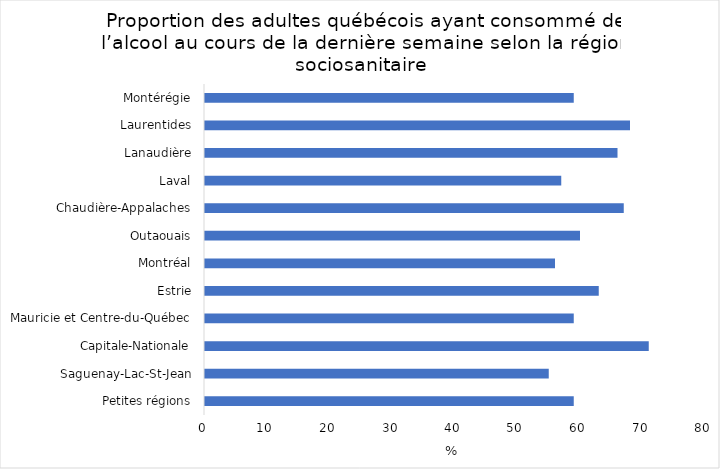
| Category | Series 0 |
|---|---|
| Petites régions | 59 |
| Saguenay-Lac-St-Jean | 55 |
| Capitale-Nationale | 71 |
| Mauricie et Centre-du-Québec | 59 |
| Estrie | 63 |
| Montréal | 56 |
| Outaouais | 60 |
| Chaudière-Appalaches | 67 |
| Laval | 57 |
| Lanaudière | 66 |
| Laurentides | 68 |
| Montérégie | 59 |